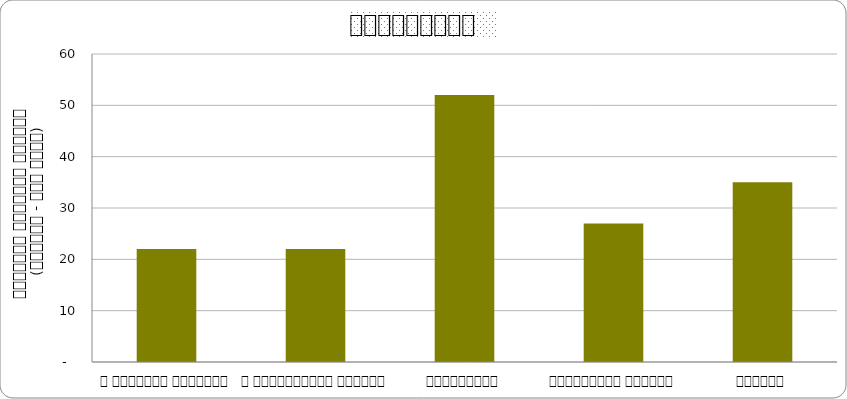
| Category | स्वास्थ्य  |
|---|---|
| द हिमालयन टाइम्स् | 22 |
| द काठमाण्डौं पोस्ट् | 22 |
| कान्तिपुर | 52 |
| अन्नपूर्ण पोस्ट् | 27 |
| नागरिक | 35 |